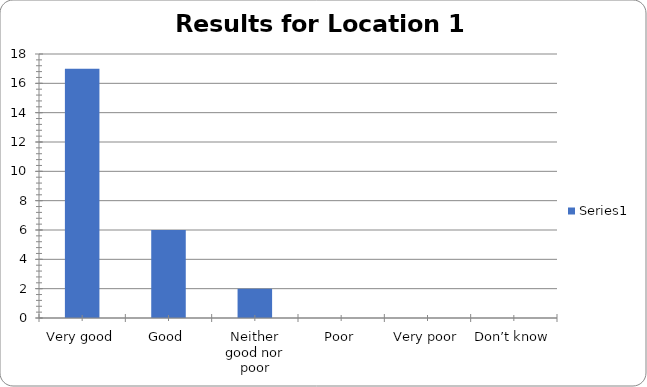
| Category | Series 0 |
|---|---|
| Very good | 17 |
| Good | 6 |
| Neither good nor poor | 2 |
| Poor | 0 |
| Very poor | 0 |
| Don’t know | 0 |